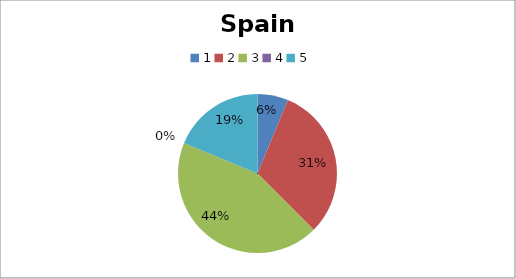
| Category | Spain |
|---|---|
| 0 | 2 |
| 1 | 10 |
| 2 | 14 |
| 3 | 0 |
| 4 | 6 |